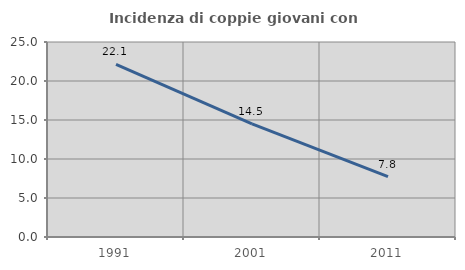
| Category | Incidenza di coppie giovani con figli |
|---|---|
| 1991.0 | 22.141 |
| 2001.0 | 14.512 |
| 2011.0 | 7.751 |